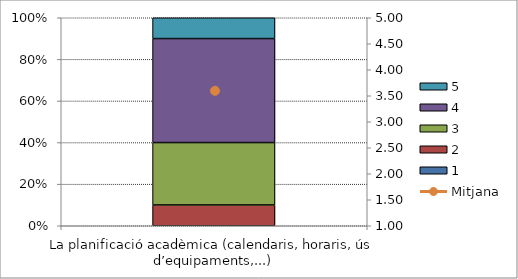
| Category | 1 | 2 | 3 | 4 | 5 |
|---|---|---|---|---|---|
| La planificació acadèmica (calendaris, horaris, ús d’equipaments,...) | 0 | 1 | 3 | 5 | 1 |